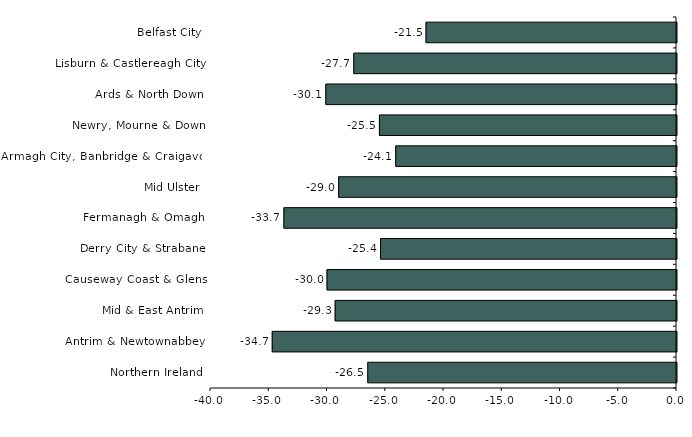
| Category | Series 0 |
|---|---|
| Belfast City | -21.5 |
| Lisburn & Castlereagh City | -27.7 |
| Ards & North Down | -30.1 |
| Newry, Mourne & Down | -25.5 |
| Armagh City, Banbridge & Craigavon | -24.1 |
| Mid Ulster | -29 |
| Fermanagh & Omagh | -33.7 |
| Derry City & Strabane | -25.4 |
| Causeway Coast & Glens | -30 |
| Mid & East Antrim | -29.3 |
| Antrim & Newtownabbey | -34.7 |
| Northern Ireland | -26.5 |